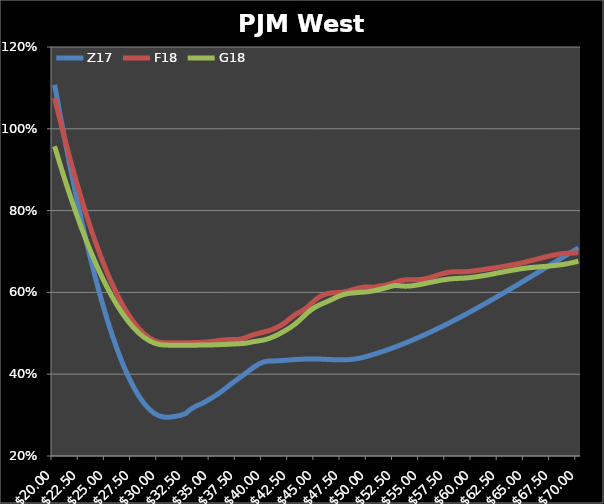
| Category | Z17 | F18 | G18 |
|---|---|---|---|
| 20.0 | 1.108 | 1.075 | 0.957 |
| 20.5 | 1.037 | 1.023 | 0.915 |
| 21.0 | 0.97 | 0.972 | 0.874 |
| 21.5 | 0.905 | 0.924 | 0.835 |
| 22.0 | 0.843 | 0.878 | 0.798 |
| 22.5 | 0.784 | 0.834 | 0.762 |
| 23.0 | 0.728 | 0.792 | 0.728 |
| 23.5 | 0.675 | 0.753 | 0.697 |
| 24.0 | 0.625 | 0.716 | 0.667 |
| 24.5 | 0.579 | 0.681 | 0.639 |
| 25.0 | 0.535 | 0.649 | 0.613 |
| 25.5 | 0.495 | 0.62 | 0.589 |
| 26.0 | 0.459 | 0.593 | 0.567 |
| 26.5 | 0.426 | 0.569 | 0.547 |
| 27.0 | 0.396 | 0.547 | 0.53 |
| 27.5 | 0.37 | 0.529 | 0.515 |
| 28.0 | 0.348 | 0.513 | 0.502 |
| 28.5 | 0.33 | 0.5 | 0.491 |
| 29.0 | 0.315 | 0.49 | 0.482 |
| 29.5 | 0.305 | 0.482 | 0.476 |
| 30.0 | 0.298 | 0.478 | 0.473 |
| 30.5 | 0.295 | 0.477 | 0.471 |
| 31.0 | 0.295 | 0.477 | 0.471 |
| 31.5 | 0.297 | 0.477 | 0.471 |
| 32.0 | 0.299 | 0.477 | 0.471 |
| 32.5 | 0.304 | 0.477 | 0.471 |
| 33.0 | 0.315 | 0.477 | 0.471 |
| 33.5 | 0.322 | 0.477 | 0.471 |
| 34.0 | 0.328 | 0.478 | 0.471 |
| 34.5 | 0.334 | 0.479 | 0.471 |
| 35.0 | 0.342 | 0.48 | 0.472 |
| 35.5 | 0.35 | 0.482 | 0.472 |
| 36.0 | 0.359 | 0.483 | 0.472 |
| 36.5 | 0.369 | 0.485 | 0.473 |
| 37.0 | 0.379 | 0.485 | 0.474 |
| 37.5 | 0.388 | 0.485 | 0.474 |
| 38.0 | 0.398 | 0.488 | 0.475 |
| 38.5 | 0.407 | 0.492 | 0.477 |
| 39.0 | 0.417 | 0.497 | 0.48 |
| 39.5 | 0.425 | 0.5 | 0.481 |
| 40.0 | 0.43 | 0.503 | 0.484 |
| 40.5 | 0.432 | 0.507 | 0.488 |
| 41.0 | 0.432 | 0.512 | 0.493 |
| 41.5 | 0.433 | 0.518 | 0.499 |
| 42.0 | 0.434 | 0.526 | 0.506 |
| 42.5 | 0.435 | 0.537 | 0.514 |
| 43.0 | 0.436 | 0.546 | 0.523 |
| 43.5 | 0.437 | 0.553 | 0.535 |
| 44.0 | 0.437 | 0.561 | 0.547 |
| 44.5 | 0.437 | 0.573 | 0.558 |
| 45.0 | 0.437 | 0.584 | 0.566 |
| 45.5 | 0.437 | 0.592 | 0.572 |
| 46.0 | 0.436 | 0.597 | 0.577 |
| 46.5 | 0.436 | 0.599 | 0.583 |
| 47.0 | 0.435 | 0.6 | 0.589 |
| 47.5 | 0.435 | 0.601 | 0.594 |
| 48.0 | 0.435 | 0.603 | 0.598 |
| 48.5 | 0.437 | 0.607 | 0.599 |
| 49.0 | 0.439 | 0.611 | 0.6 |
| 49.5 | 0.441 | 0.613 | 0.601 |
| 50.0 | 0.445 | 0.613 | 0.602 |
| 50.5 | 0.449 | 0.613 | 0.604 |
| 51.0 | 0.453 | 0.616 | 0.607 |
| 51.5 | 0.457 | 0.618 | 0.61 |
| 52.0 | 0.462 | 0.621 | 0.614 |
| 52.5 | 0.466 | 0.625 | 0.617 |
| 53.0 | 0.471 | 0.629 | 0.616 |
| 53.5 | 0.476 | 0.631 | 0.615 |
| 54.0 | 0.482 | 0.631 | 0.616 |
| 54.5 | 0.487 | 0.631 | 0.618 |
| 55.0 | 0.493 | 0.632 | 0.62 |
| 55.5 | 0.499 | 0.634 | 0.622 |
| 56.0 | 0.504 | 0.638 | 0.625 |
| 56.5 | 0.511 | 0.642 | 0.628 |
| 57.0 | 0.517 | 0.646 | 0.63 |
| 57.5 | 0.523 | 0.649 | 0.632 |
| 58.0 | 0.53 | 0.651 | 0.633 |
| 58.5 | 0.536 | 0.651 | 0.634 |
| 59.0 | 0.543 | 0.65 | 0.635 |
| 59.5 | 0.55 | 0.651 | 0.636 |
| 60.0 | 0.557 | 0.653 | 0.637 |
| 60.5 | 0.564 | 0.655 | 0.639 |
| 61.0 | 0.571 | 0.656 | 0.641 |
| 61.5 | 0.578 | 0.658 | 0.643 |
| 62.0 | 0.586 | 0.66 | 0.646 |
| 62.5 | 0.593 | 0.662 | 0.648 |
| 63.0 | 0.601 | 0.664 | 0.651 |
| 63.5 | 0.608 | 0.666 | 0.653 |
| 64.0 | 0.616 | 0.669 | 0.656 |
| 64.5 | 0.623 | 0.672 | 0.658 |
| 65.0 | 0.631 | 0.675 | 0.659 |
| 65.5 | 0.639 | 0.678 | 0.661 |
| 66.0 | 0.647 | 0.681 | 0.662 |
| 66.5 | 0.654 | 0.684 | 0.663 |
| 67.0 | 0.662 | 0.688 | 0.664 |
| 67.5 | 0.67 | 0.691 | 0.665 |
| 68.0 | 0.678 | 0.693 | 0.667 |
| 68.5 | 0.686 | 0.695 | 0.668 |
| 69.0 | 0.693 | 0.696 | 0.67 |
| 69.5 | 0.701 | 0.696 | 0.673 |
| 70.0 | 0.709 | 0.697 | 0.676 |